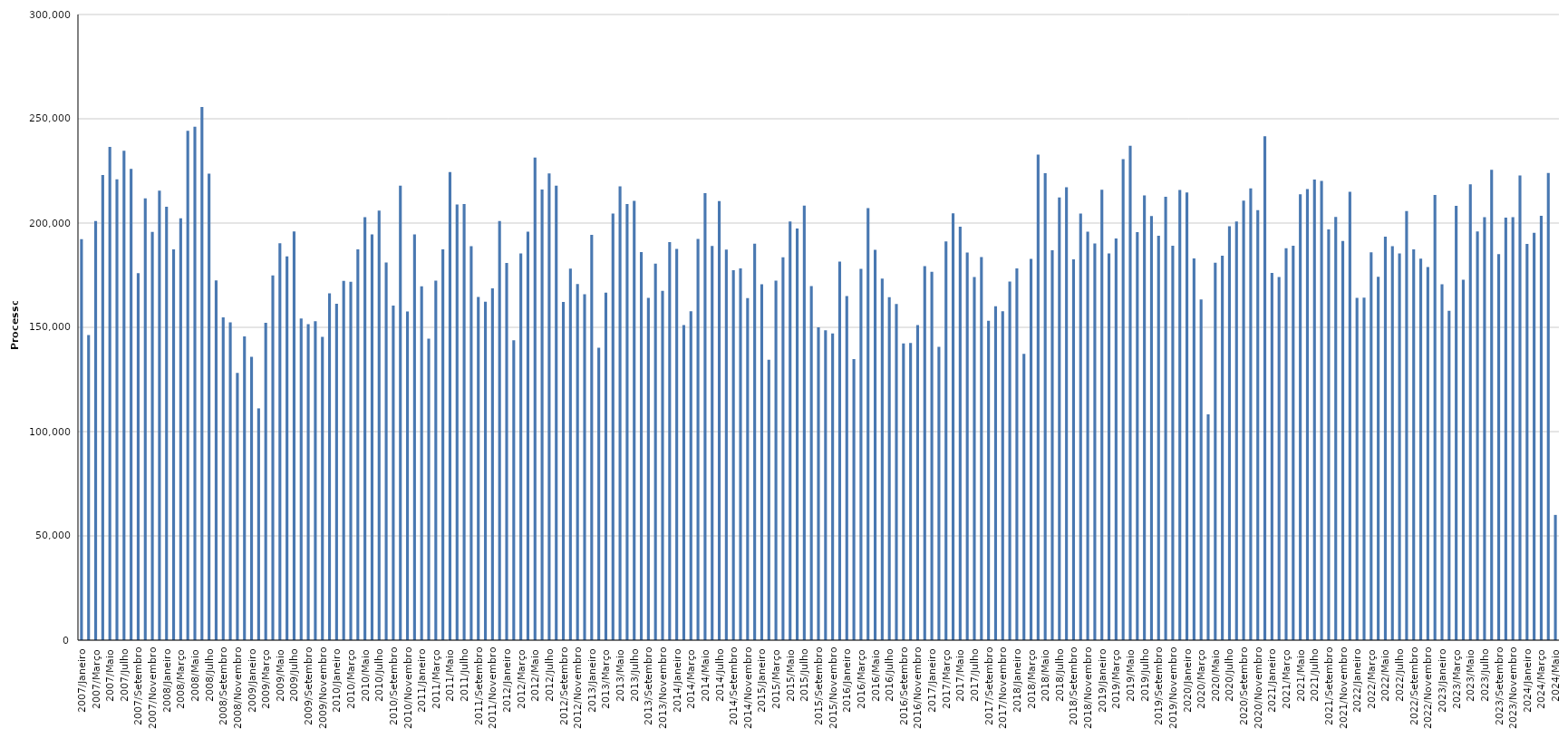
| Category | Processos |
|---|---|
| 2007/Janeiro | 192324 |
| 2007/Fevereiro | 146276 |
| 2007/Março | 201011 |
| 2007/Abril | 223091 |
| 2007/Maio | 236576 |
| 2007/Junho | 220964 |
| 2007/Julho | 234646 |
| 2007/Agosto | 225953 |
| 2007/Setembro | 176019 |
| 2007/Outubro | 211900 |
| 2007/Novembro | 195737 |
| 2007/Dezembro | 215511 |
| 2008/Janeiro | 207874 |
| 2008/Fevereiro | 187408 |
| 2008/Março | 202230 |
| 2008/Abril | 244210 |
| 2008/Maio | 246207 |
| 2008/Junho | 255696 |
| 2008/Julho | 223747 |
| 2008/Agosto | 172516 |
| 2008/Setembro | 154762 |
| 2008/Outubro | 152380 |
| 2008/Novembro | 128174 |
| 2008/Dezembro | 145673 |
| 2009/Janeiro | 135872 |
| 2009/Fevereiro | 111136 |
| 2009/Março | 152217 |
| 2009/Abril | 174930 |
| 2009/Maio | 190364 |
| 2009/Junho | 184065 |
| 2009/Julho | 195997 |
| 2009/Agosto | 154251 |
| 2009/Setembro | 151486 |
| 2009/Outubro | 152889 |
| 2009/Novembro | 145407 |
| 2009/Dezembro | 166325 |
| 2010/Janeiro | 161323 |
| 2010/Fevereiro | 172293 |
| 2010/Março | 171897 |
| 2010/Abril | 187389 |
| 2010/Maio | 202812 |
| 2010/Junho | 194539 |
| 2010/Julho | 206016 |
| 2010/Agosto | 181060 |
| 2010/Setembro | 160405 |
| 2010/Outubro | 217939 |
| 2010/Novembro | 157648 |
| 2010/Dezembro | 194556 |
| 2011/Janeiro | 169665 |
| 2011/Fevereiro | 144520 |
| 2011/Março | 172348 |
| 2011/Abril | 187352 |
| 2011/Maio | 224421 |
| 2011/Junho | 208871 |
| 2011/Julho | 209139 |
| 2011/Agosto | 188867 |
| 2011/Setembro | 164596 |
| 2011/Outubro | 162259 |
| 2011/Novembro | 168676 |
| 2011/Dezembro | 200983 |
| 2012/Janeiro | 180880 |
| 2012/Fevereiro | 143784 |
| 2012/Março | 185404 |
| 2012/Abril | 195907 |
| 2012/Maio | 231392 |
| 2012/Junho | 216122 |
| 2012/Julho | 223844 |
| 2012/Agosto | 217964 |
| 2012/Setembro | 162167 |
| 2012/Outubro | 178187 |
| 2012/Novembro | 170756 |
| 2012/Dezembro | 165892 |
| 2013/Janeiro | 194329 |
| 2013/Fevereiro | 140243 |
| 2013/Março | 166659 |
| 2013/Abril | 204564 |
| 2013/Maio | 217583 |
| 2013/Junho | 209135 |
| 2013/Julho | 210627 |
| 2013/Agosto | 186113 |
| 2013/Setembro | 164104 |
| 2013/Outubro | 180502 |
| 2013/Novembro | 167504 |
| 2013/Dezembro | 190906 |
| 2014/Janeiro | 187659 |
| 2014/Fevereiro | 151092 |
| 2014/Março | 157715 |
| 2014/Abril | 192344 |
| 2014/Maio | 214342 |
| 2014/Junho | 189029 |
| 2014/Julho | 210576 |
| 2014/Agosto | 187238 |
| 2014/Setembro | 177441 |
| 2014/Outubro | 178212 |
| 2014/Novembro | 164019 |
| 2014/Dezembro | 190112 |
| 2015/Janeiro | 170677 |
| 2015/Fevereiro | 134468 |
| 2015/Março | 172441 |
| 2015/Abril | 183639 |
| 2015/Maio | 200796 |
| 2015/Junho | 197419 |
| 2015/Julho | 208365 |
| 2015/Agosto | 169767 |
| 2015/Setembro | 149991 |
| 2015/Outubro | 148600 |
| 2015/Novembro | 147033 |
| 2015/Dezembro | 181576 |
| 2016/Janeiro | 165016 |
| 2016/Fevereiro | 134758 |
| 2016/Março | 178041 |
| 2016/Abril | 207185 |
| 2016/Maio | 187121 |
| 2016/Junho | 173330 |
| 2016/Julho | 164432 |
| 2016/Agosto | 161233 |
| 2016/Setembro | 142295 |
| 2016/Outubro | 142477 |
| 2016/Novembro | 151134 |
| 2016/Dezembro | 179396 |
| 2017/Janeiro | 176651 |
| 2017/Fevereiro | 140655 |
| 2017/Março | 191219 |
| 2017/Abril | 204639 |
| 2017/Maio | 198278 |
| 2017/Junho | 185851 |
| 2017/Julho | 174089 |
| 2017/Agosto | 183671 |
| 2017/Setembro | 153171 |
| 2017/Outubro | 160058 |
| 2017/Novembro | 157733 |
| 2017/Dezembro | 171911 |
| 2018/Janeiro | 178238 |
| 2018/Fevereiro | 137266 |
| 2018/Março | 182798 |
| 2018/Abril | 232795 |
| 2018/Maio | 223955 |
| 2018/Junho | 186914 |
| 2018/Julho | 212324 |
| 2018/Agosto | 217163 |
| 2018/Setembro | 182604 |
| 2018/Outubro | 204552 |
| 2018/Novembro | 195870 |
| 2018/Dezembro | 190255 |
| 2019/Janeiro | 215950 |
| 2019/Fevereiro | 185440 |
| 2019/Março | 192661 |
| 2019/Abril | 230675 |
| 2019/Maio | 237027 |
| 2019/Junho | 195618 |
| 2019/Julho | 213255 |
| 2019/Agosto | 203401 |
| 2019/Setembro | 193881 |
| 2019/Outubro | 212623 |
| 2019/Novembro | 189092 |
| 2019/Dezembro | 215906 |
| 2020/Janeiro | 214639 |
| 2020/Fevereiro | 183006 |
| 2020/Março | 163350 |
| 2020/Abril | 108310 |
| 2020/Maio | 180983 |
| 2020/Junho | 184379 |
| 2020/Julho | 198462 |
| 2020/Agosto | 200787 |
| 2020/Setembro | 210741 |
| 2020/Outubro | 216614 |
| 2020/Novembro | 206197 |
| 2020/Dezembro | 241635 |
| 2021/Janeiro | 176109 |
| 2021/Fevereiro | 174171 |
| 2021/Março | 187910 |
| 2021/Abril | 189091 |
| 2021/Maio | 213783 |
| 2021/Junho | 216312 |
| 2021/Julho | 220845 |
| 2021/Agosto | 220201 |
| 2021/Setembro | 196962 |
| 2021/Outubro | 202892 |
| 2021/Novembro | 191416 |
| 2021/Dezembro | 215000 |
| 2022/Janeiro | 164145 |
| 2022/Fevereiro | 164208 |
| 2022/Março | 185936 |
| 2022/Abril | 174250 |
| 2022/Maio | 193480 |
| 2022/Junho | 188880 |
| 2022/Julho | 185394 |
| 2022/Agosto | 205735 |
| 2022/Setembro | 187423 |
| 2022/Outubro | 182899 |
| 2022/Novembro | 178950 |
| 2022/Dezembro | 213466 |
| 2023/Janeiro | 170683 |
| 2023/Fevereiro | 157900 |
| 2023/Março | 208263 |
| 2023/Abril | 172788 |
| 2023/Maio | 218596 |
| 2023/Junho | 196009 |
| 2023/Julho | 202829 |
| 2023/Agosto | 225549 |
| 2023/Setembro | 185069 |
| 2023/Outubro | 202598 |
| 2023/Novembro | 202857 |
| 2023/Dezembro | 222789 |
| 2024/Janeiro | 189970 |
| 2024/Fevereiro | 195376 |
| 2024/Março | 203511 |
| 2024/Abril | 224038 |
| 2024/Maio | 60053 |